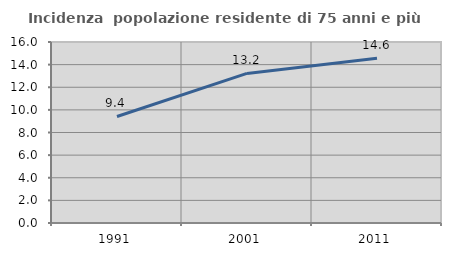
| Category | Incidenza  popolazione residente di 75 anni e più |
|---|---|
| 1991.0 | 9.417 |
| 2001.0 | 13.222 |
| 2011.0 | 14.553 |